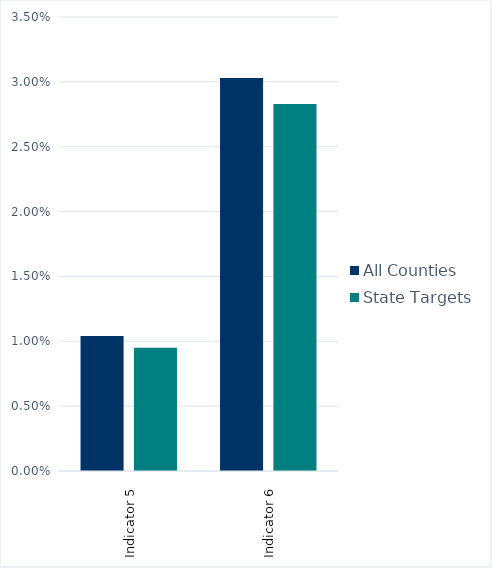
| Category | All Counties | State Targets |
|---|---|---|
| Indicator 5 | 0.01 | 0.01 |
| Indicator 6 | 0.03 | 0.028 |